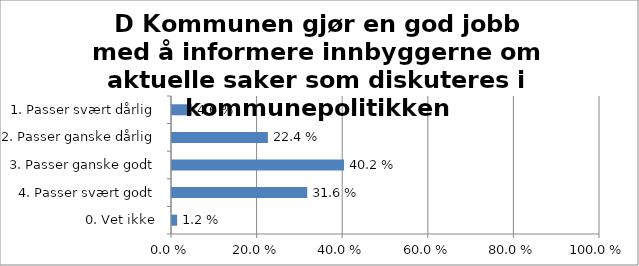
| Category | D Kommunen gjør en god jobb med å informere innbyggerne om aktuelle saker som diskuteres i kommunepolitikken |
|---|---|
| 1. Passer svært dårlig | 0.046 |
| 2. Passer ganske dårlig | 0.224 |
| 3. Passer ganske godt | 0.402 |
| 4. Passer svært godt | 0.316 |
| 0. Vet ikke | 0.012 |